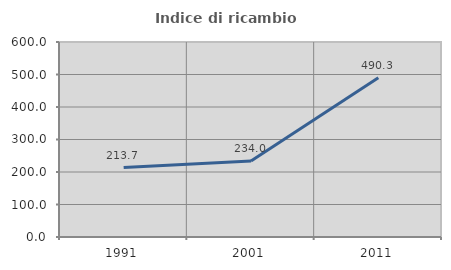
| Category | Indice di ricambio occupazionale  |
|---|---|
| 1991.0 | 213.725 |
| 2001.0 | 234.043 |
| 2011.0 | 490.323 |